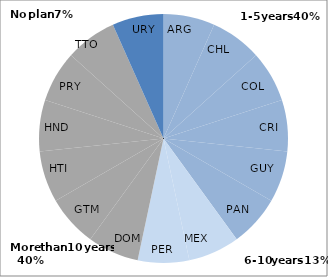
| Category | Time period covered by strategic vision documents |
|---|---|
| ARG | 0.067 |
| CHL | 0.067 |
| COL | 0.067 |
| CRI | 0.067 |
| GUY | 0.067 |
| PAN | 0.067 |
| MEX | 0.067 |
| PER | 0.067 |
| DOM | 0.067 |
| GTM | 0.067 |
| HTI | 0.067 |
| HND | 0.067 |
| PRY | 0.067 |
| TTO | 0.067 |
| URY | 0.067 |